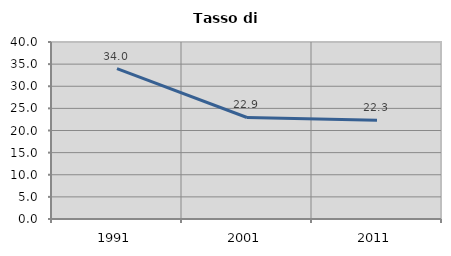
| Category | Tasso di disoccupazione   |
|---|---|
| 1991.0 | 33.99 |
| 2001.0 | 22.943 |
| 2011.0 | 22.333 |